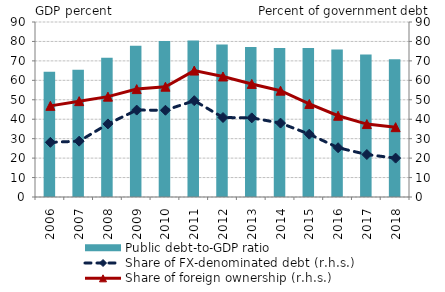
| Category | Public debt-to-GDP ratio |
|---|---|
| 2006.0 | 64.456 |
| 2007.0 | 65.472 |
| 2008.0 | 71.581 |
| 2009.0 | 77.842 |
| 2010.0 | 80.249 |
| 2011.0 | 80.482 |
| 2012.0 | 78.373 |
| 2013.0 | 77.145 |
| 2014.0 | 76.649 |
| 2015.0 | 76.607 |
| 2016.0 | 75.864 |
| 2017.0 | 73.251 |
| 2018.0 | 70.9 |